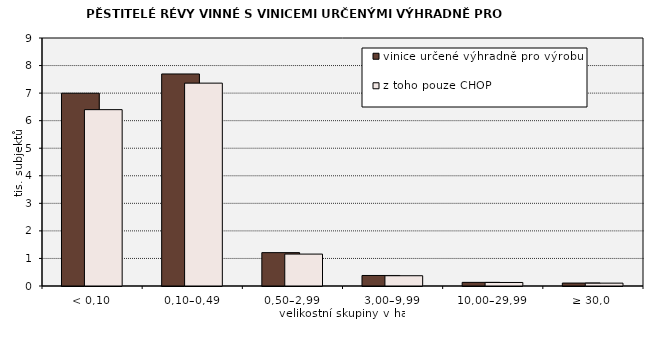
| Category | vinice určené výhradně pro výrobu vína | z toho pouze CHOP |
|---|---|---|
| < 0,10 | 6996 | 6400 |
| 0,10–0,49 | 7695 | 7362 |
| 0,50–2,99 | 1211 | 1158 |
| 3,00–9,99 | 382 | 373 |
| 10,00–29,99 | 132 | 128 |
| ≥ 30,0 | 107 | 104 |